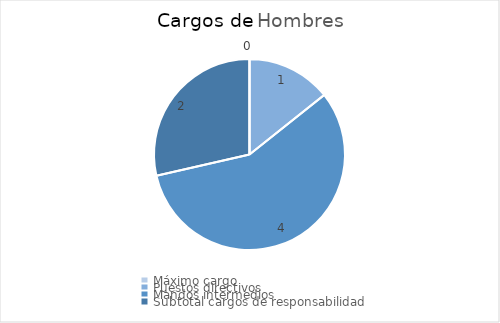
| Category | Hombres |
|---|---|
| Máximo cargo  | 0 |
| Puestos directivos | 1 |
| Mandos intermedios | 4 |
| Subtotal cargos de responsabilidad | 2 |